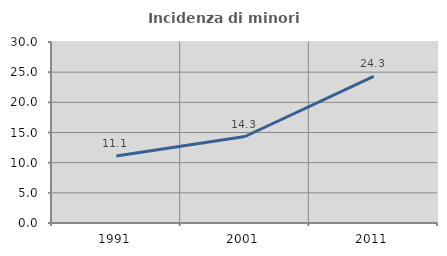
| Category | Incidenza di minori stranieri |
|---|---|
| 1991.0 | 11.111 |
| 2001.0 | 14.334 |
| 2011.0 | 24.306 |